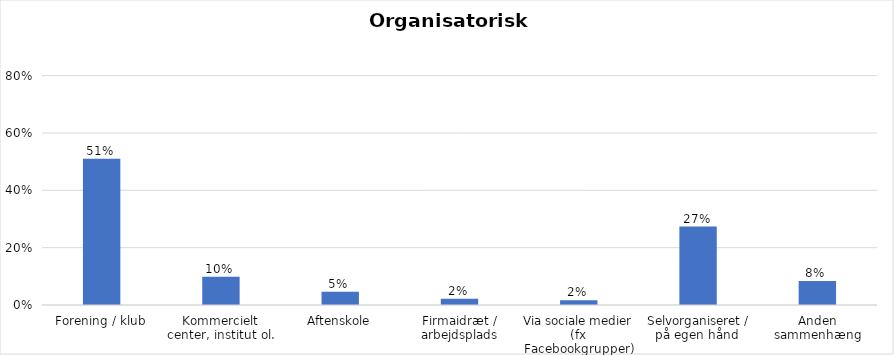
| Category | % |
|---|---|
| Forening / klub | 0.51 |
| Kommercielt center, institut ol. | 0.099 |
| Aftenskole | 0.046 |
| Firmaidræt / arbejdsplads | 0.022 |
| Via sociale medier (fx Facebookgrupper) | 0.017 |
| Selvorganiseret / på egen hånd  | 0.274 |
| Anden sammenhæng | 0.084 |